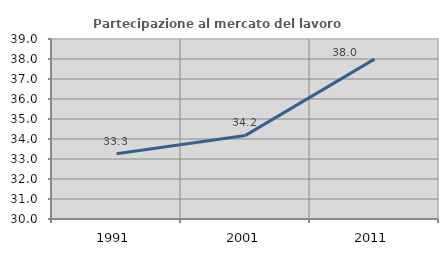
| Category | Partecipazione al mercato del lavoro  femminile |
|---|---|
| 1991.0 | 33.258 |
| 2001.0 | 34.18 |
| 2011.0 | 37.993 |